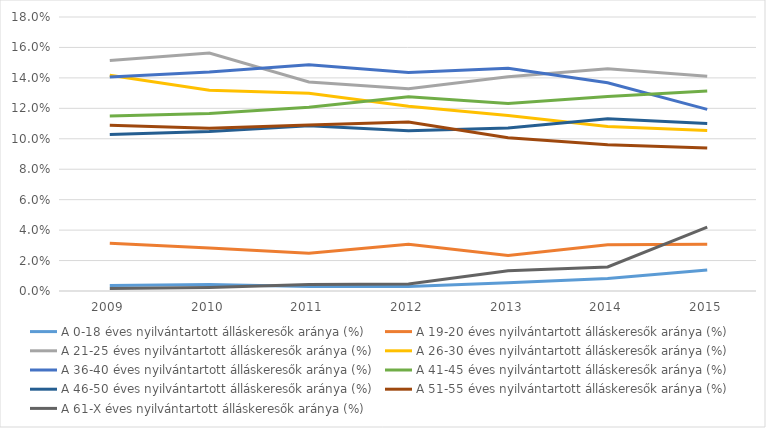
| Category | A 0-18 éves nyilvántartott álláskeresők aránya (%) | A 19-20 éves nyilvántartott álláskeresők aránya (%) | A 21-25 éves nyilvántartott álláskeresők aránya (%) | A 26-30 éves nyilvántartott álláskeresők aránya (%) | A 36-40 éves nyilvántartott álláskeresők aránya (%) | A 41-45 éves nyilvántartott álláskeresők aránya (%) | A 46-50 éves nyilvántartott álláskeresők aránya (%) | A 51-55 éves nyilvántartott álláskeresők aránya (%) | A 61-X éves nyilvántartott álláskeresők aránya (%) |
|---|---|---|---|---|---|---|---|---|---|
| 2009.0 | 0.004 | 0.031 | 0.151 | 0.142 | 0.141 | 0.115 | 0.103 | 0.109 | 0.002 |
| 2010.0 | 0.004 | 0.028 | 0.156 | 0.132 | 0.144 | 0.117 | 0.105 | 0.107 | 0.002 |
| 2011.0 | 0.003 | 0.025 | 0.137 | 0.13 | 0.149 | 0.121 | 0.109 | 0.109 | 0.004 |
| 2012.0 | 0.003 | 0.031 | 0.133 | 0.121 | 0.144 | 0.128 | 0.105 | 0.111 | 0.005 |
| 2013.0 | 0.005 | 0.023 | 0.141 | 0.115 | 0.146 | 0.123 | 0.107 | 0.101 | 0.013 |
| 2014.0 | 0.008 | 0.03 | 0.146 | 0.108 | 0.137 | 0.128 | 0.113 | 0.096 | 0.016 |
| 2015.0 | 0.014 | 0.031 | 0.141 | 0.105 | 0.119 | 0.131 | 0.11 | 0.094 | 0.042 |